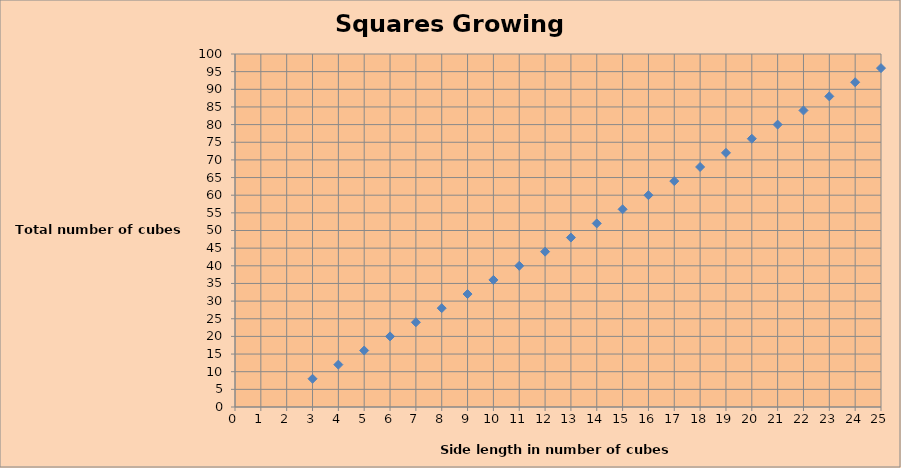
| Category | Total number of cubes ( c ) |
|---|---|
| 3.0 | 8 |
| 4.0 | 12 |
| 5.0 | 16 |
| 6.0 | 20 |
| 7.0 | 24 |
| 8.0 | 28 |
| 9.0 | 32 |
| 10.0 | 36 |
| 11.0 | 40 |
| 12.0 | 44 |
| 13.0 | 48 |
| 14.0 | 52 |
| 15.0 | 56 |
| 16.0 | 60 |
| 17.0 | 64 |
| 18.0 | 68 |
| 19.0 | 72 |
| 20.0 | 76 |
| 21.0 | 80 |
| 22.0 | 84 |
| 23.0 | 88 |
| 24.0 | 92 |
| 25.0 | 96 |